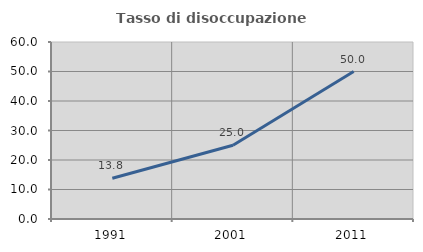
| Category | Tasso di disoccupazione giovanile  |
|---|---|
| 1991.0 | 13.793 |
| 2001.0 | 25 |
| 2011.0 | 50 |